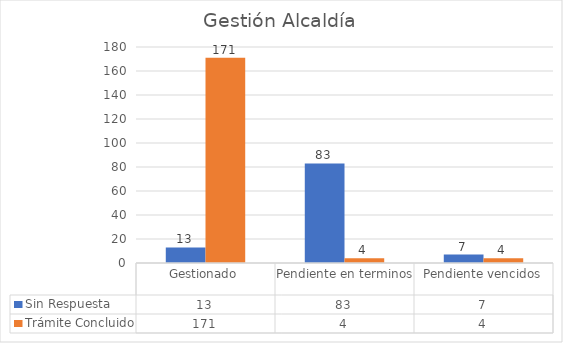
| Category | Sin Respuesta | Trámite Concluido |
|---|---|---|
| Gestionado | 13 | 171 |
| Pendiente en terminos | 83 | 4 |
| Pendiente vencidos | 7 | 4 |